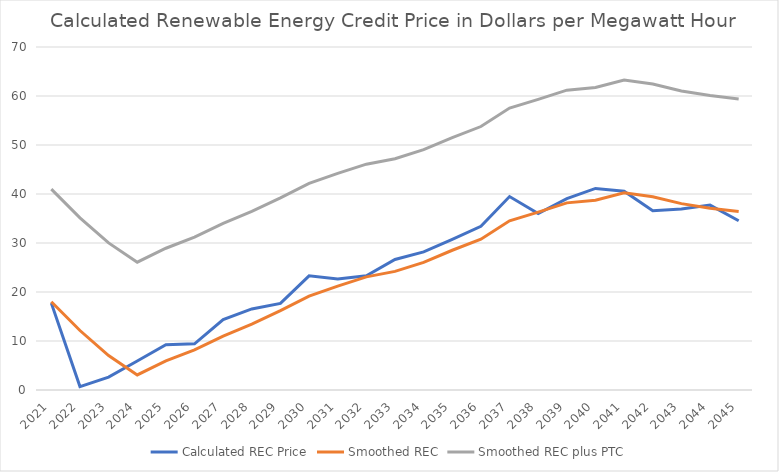
| Category | Calculated REC Price | Smoothed REC | Smoothed REC plus PTC |
|---|---|---|---|
| 2021 | 17.728 | 18 | 41 |
| 2022 | 0.698 | 12.14 | 35.14 |
| 2023 | 2.625 | 7.02 | 30.02 |
| 2024 | 5.921 | 3.08 | 26.08 |
| 2025 | 9.246 | 5.93 | 28.93 |
| 2026 | 9.428 | 8.2 | 31.2 |
| 2027 | 14.369 | 11.01 | 34.01 |
| 2028 | 16.547 | 13.45 | 36.45 |
| 2029 | 17.672 | 16.2 | 39.2 |
| 2030 | 23.306 | 19.17 | 42.17 |
| 2031 | 22.654 | 21.21 | 44.21 |
| 2032 | 23.324 | 23.09 | 46.09 |
| 2033 | 26.647 | 24.21 | 47.21 |
| 2034 | 28.187 | 26.05 | 49.05 |
| 2035 | 30.729 | 28.52 | 51.52 |
| 2036 | 33.398 | 30.77 | 53.77 |
| 2037 | 39.483 | 34.54 | 57.54 |
| 2038 | 36.026 | 36.3 | 59.3 |
| 2039 | 39.046 | 38.19 | 61.19 |
| 2040 | 41.141 | 38.74 | 61.74 |
| 2041 | 40.566 | 40.25 | 63.25 |
| 2042 | 36.575 | 39.43 | 62.43 |
| 2043 | 36.961 | 38.03 | 61.03 |
| 2044 | 37.732 | 37.09 | 60.09 |
| 2045 | 34.549 | 36.41 | 59.41 |